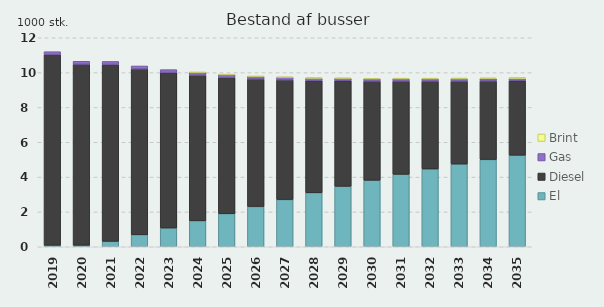
| Category | El | Diesel | Gas | Brint |
|---|---|---|---|---|
| 2019 | 0.09 | 10.95 | 0.16 | 0 |
| 2020 | 0.09 | 10.39 | 0.17 | 0 |
| 2021 | 0.31 | 10.16 | 0.17 | 0 |
| 2022 | 0.69 | 9.52 | 0.17 | 0 |
| 2023 | 1.08 | 8.93 | 0.16 | 0 |
| 2024 | 1.49 | 8.36 | 0.16 | 0.01 |
| 2025 | 1.9 | 7.82 | 0.16 | 0.01 |
| 2026 | 2.31 | 7.32 | 0.15 | 0.01 |
| 2027 | 2.71 | 6.87 | 0.15 | 0.02 |
| 2028 | 3.1 | 6.44 | 0.14 | 0.02 |
| 2029 | 3.47 | 6.06 | 0.14 | 0.02 |
| 2030 | 3.82 | 5.69 | 0.13 | 0.03 |
| 2031 | 4.16 | 5.35 | 0.13 | 0.04 |
| 2032 | 4.47 | 5.04 | 0.13 | 0.04 |
| 2033 | 4.75 | 4.76 | 0.13 | 0.05 |
| 2034 | 5.01 | 4.51 | 0.13 | 0.05 |
| 2035 | 5.26 | 4.27 | 0.13 | 0.06 |